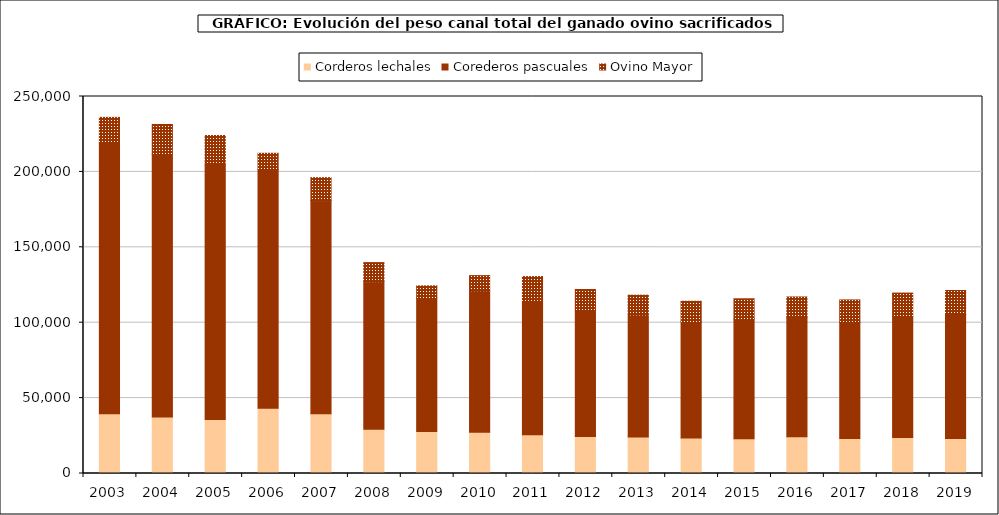
| Category | Corderos lechales | Corederos pascuales | Ovino Mayor |
|---|---|---|---|
| 2003.0 | 39573.4 | 179725.3 | 16855.9 |
| 2004.0 | 37496.969 | 174277.868 | 19688.149 |
| 2005.0 | 35754.734 | 170498.91 | 17872.177 |
| 2006.0 | 43265.425 | 158365.03 | 10706.408 |
| 2007.0 | 39690.287 | 141268.902 | 15229.867 |
| 2008.0 | 29352.285 | 97819.486 | 12681.385 |
| 2009.0 | 27925.256 | 88381.226 | 8117.939 |
| 2010.0 | 27286.013 | 93907.831 | 10041.667 |
| 2011.0 | 25698.493 | 89080.753 | 15807.735 |
| 2012.0 | 24460.359 | 83612.064 | 13930.517 |
| 2013.0 | 24211.15 | 80940.811 | 13108.832 |
| 2014.0 | 23588.116 | 77006.078 | 13625.766 |
| 2015.0 | 23076.847 | 79590.934 | 13196.397 |
| 2016.0 | 24442.917 | 79269.05 | 13341.651 |
| 2017.0 | 23138.411 | 77132.114 | 14843.253 |
| 2018.0 | 23802.289 | 80390.596 | 15449.556 |
| 2019.0 | 23285.344 | 82244.862 | 15808.27 |